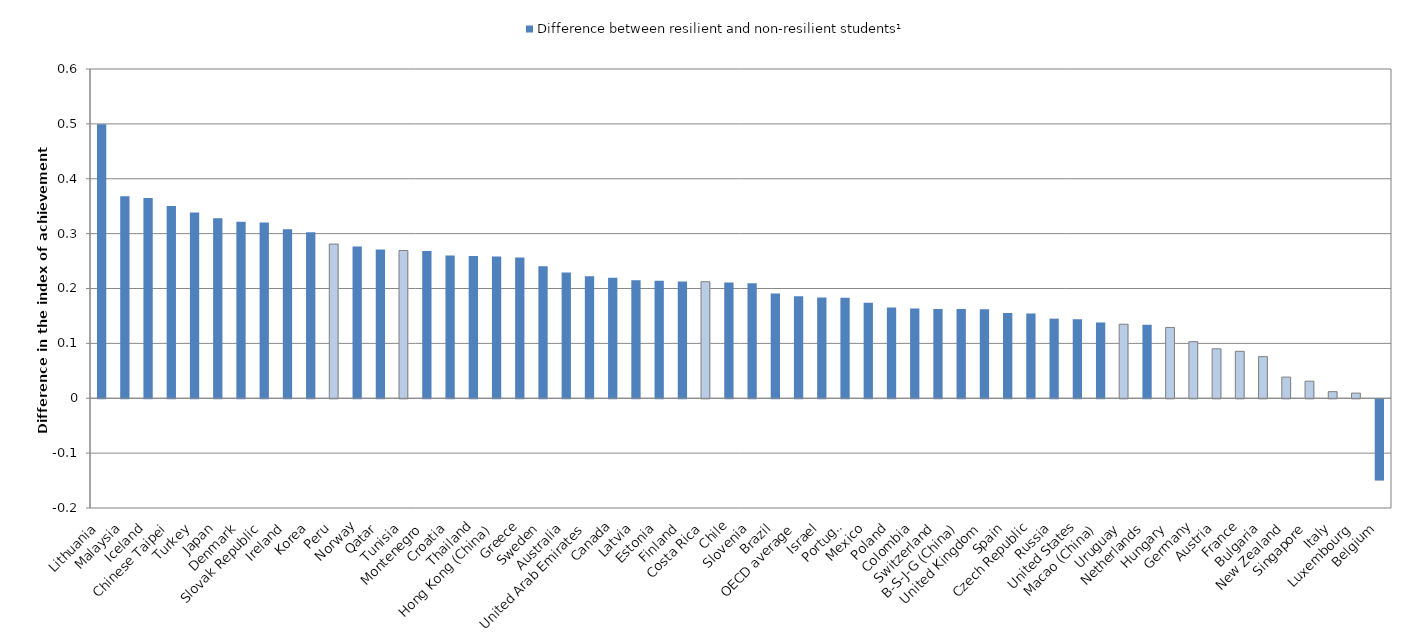
| Category | Difference between resilient and non-resilient students¹ | NS |
|---|---|---|
| Lithuania | 0.499 | 0 |
| Malaysia | 0.368 | 0 |
| Iceland | 0.365 | 0 |
| Chinese Taipei | 0.35 | 0 |
| Turkey | 0.339 | 0 |
| Japan | 0.328 | 0 |
| Denmark | 0.321 | 0 |
| Slovak Republic | 0.32 | 0 |
| Ireland | 0.308 | 0 |
| Korea | 0.303 | 0 |
| Peru | 0 | 0.281 |
| Norway | 0.276 | 0 |
| Qatar | 0.271 | 0 |
| Tunisia | 0 | 0.269 |
| Montenegro | 0.268 | 0 |
| Croatia | 0.26 | 0 |
| Thailand | 0.259 | 0 |
| Hong Kong (China) | 0.258 | 0 |
| Greece | 0.256 | 0 |
| Sweden | 0.241 | 0 |
| Australia | 0.229 | 0 |
| United Arab Emirates | 0.223 | 0 |
| Canada | 0.22 | 0 |
| Latvia | 0.215 | 0 |
| Estonia | 0.214 | 0 |
| Finland | 0.213 | 0 |
| Costa Rica | 0 | 0.212 |
| Chile | 0.211 | 0 |
| Slovenia | 0.209 | 0 |
| Brazil | 0.191 | 0 |
| OECD average | 0.186 | 0 |
| Israel | 0.184 | 0 |
| Portugal | 0.183 | 0 |
| Mexico | 0.174 | 0 |
| Poland | 0.165 | 0 |
| Colombia | 0.163 | 0 |
| Switzerland | 0.163 | 0 |
| B-S-J-G (China) | 0.163 | 0 |
| United Kingdom | 0.162 | 0 |
| Spain | 0.155 | 0 |
| Czech Republic | 0.154 | 0 |
| Russia | 0.145 | 0 |
| United States | 0.144 | 0 |
| Macao (China) | 0.138 | 0 |
| Uruguay | 0 | 0.135 |
| Netherlands | 0.134 | 0 |
| Hungary | 0 | 0.129 |
| Germany | 0 | 0.103 |
| Austria | 0 | 0.09 |
| France | 0 | 0.086 |
| Bulgaria | 0 | 0.076 |
| New Zealand | 0 | 0.039 |
| Singapore | 0 | 0.031 |
| Italy | 0 | 0.012 |
| Luxembourg | 0 | 0.009 |
| Belgium | -0.148 | 0 |